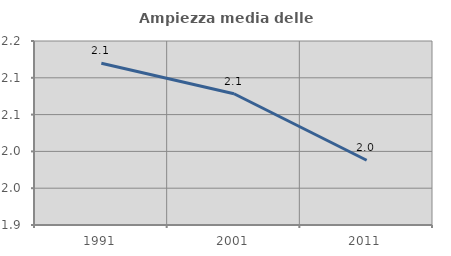
| Category | Ampiezza media delle famiglie |
|---|---|
| 1991.0 | 2.12 |
| 2001.0 | 2.078 |
| 2011.0 | 1.988 |